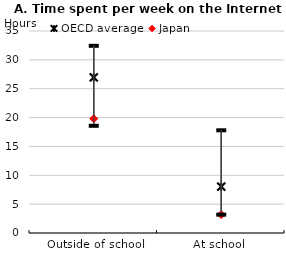
| Category | Longest | OECD average | Japan | Shortest |
|---|---|---|---|---|
|  Outside of school | 32.432 | 26.958 | 19.814 | 18.574 |
| At school | 17.795 | 8.033 | 3.178 | 3.178 |